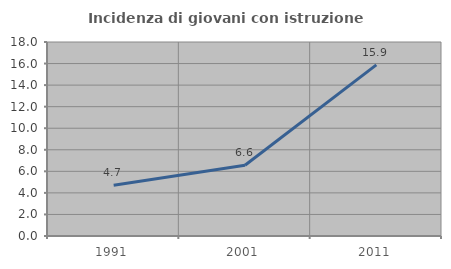
| Category | Incidenza di giovani con istruzione universitaria |
|---|---|
| 1991.0 | 4.712 |
| 2001.0 | 6.569 |
| 2011.0 | 15.877 |